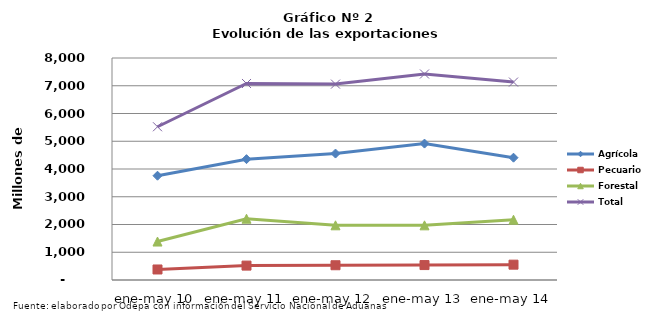
| Category | Agrícola | Pecuario | Forestal | Total |
|---|---|---|---|---|
| ene-may 10 | 3757686 | 379025 | 1385738 | 5522449 |
| ene-may 11 | 4354837 | 518624 | 2208181 | 7081642 |
| ene-may 12 | 4556413 | 531682 | 1971130 | 7059225 |
| ene-may 13 | 4915949 | 538010 | 1969950 | 7423909 |
| ene-may 14 | 4407467 | 552430 | 2172635 | 7132532 |